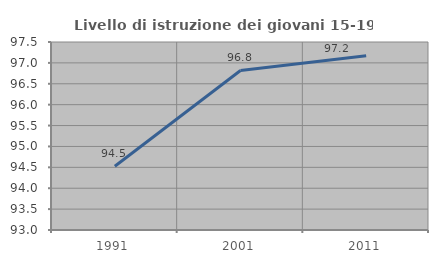
| Category | Livello di istruzione dei giovani 15-19 anni |
|---|---|
| 1991.0 | 94.524 |
| 2001.0 | 96.819 |
| 2011.0 | 97.169 |